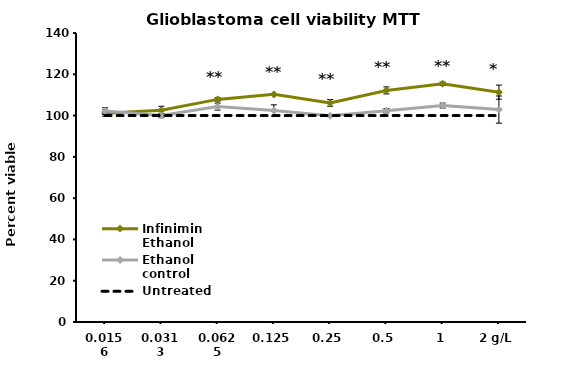
| Category | Infinimin Ethanol | Ethanol control | Untreated |
|---|---|---|---|
| 0.0156 | 101.182 | 102.198 | 100 |
| 0.0313 | 102.536 | 99.997 | 100 |
| 0.0625 | 107.841 | 104.342 | 100 |
| 0.125 | 110.267 | 102.48 | 100 |
| 0.25 | 106.148 | 99.884 | 100 |
| 0.5 | 112.186 | 102.31 | 100 |
| 1 | 115.459 | 104.85 | 100 |
| 2 g/L | 111.339 | 102.903 | 100 |